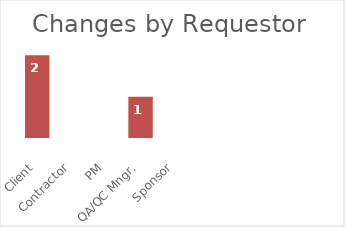
| Category | Client |
|---|---|
| Client | 2 |
| Contractor | 0 |
| PM | 0 |
| QA/QC Mngr. | 1 |
| Sponsor | 0 |